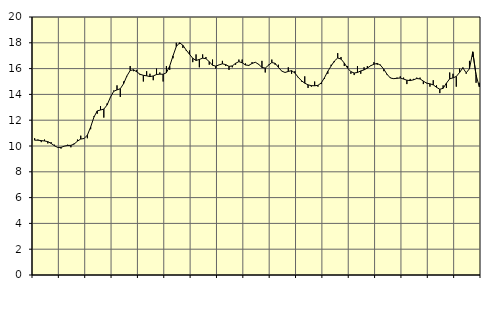
| Category | Piggar | Series 1 |
|---|---|---|
| nan | 10.6 | 10.45 |
| 87.0 | 10.5 | 10.45 |
| 87.0 | 10.3 | 10.42 |
| 87.0 | 10.5 | 10.39 |
| nan | 10.2 | 10.34 |
| 88.0 | 10.3 | 10.2 |
| 88.0 | 10.1 | 10.02 |
| 88.0 | 9.9 | 9.89 |
| nan | 9.8 | 9.89 |
| 89.0 | 10 | 9.99 |
| 89.0 | 10.1 | 10.04 |
| 89.0 | 9.9 | 10.05 |
| nan | 10.2 | 10.15 |
| 90.0 | 10.5 | 10.38 |
| 90.0 | 10.8 | 10.54 |
| 90.0 | 10.6 | 10.58 |
| nan | 10.6 | 10.84 |
| 91.0 | 11.3 | 11.47 |
| 91.0 | 12.3 | 12.24 |
| 91.0 | 12.5 | 12.72 |
| nan | 13.1 | 12.79 |
| 92.0 | 12.2 | 12.86 |
| 92.0 | 13.3 | 13.18 |
| 92.0 | 13.8 | 13.78 |
| nan | 14.3 | 14.24 |
| 93.0 | 14.7 | 14.35 |
| 93.0 | 13.8 | 14.44 |
| 93.0 | 15 | 14.83 |
| nan | 15.4 | 15.43 |
| 94.0 | 16.2 | 15.85 |
| 94.0 | 15.8 | 15.91 |
| 94.0 | 15.9 | 15.75 |
| nan | 15.5 | 15.56 |
| 95.0 | 15 | 15.48 |
| 95.0 | 15.8 | 15.44 |
| 95.0 | 15.6 | 15.38 |
| nan | 15.1 | 15.43 |
| 96.0 | 16 | 15.54 |
| 96.0 | 15.7 | 15.57 |
| 96.0 | 15 | 15.56 |
| nan | 16.2 | 15.68 |
| 97.0 | 15.9 | 16.2 |
| 97.0 | 16.8 | 16.99 |
| 97.0 | 18 | 17.71 |
| nan | 17.9 | 18 |
| 98.0 | 17.6 | 17.81 |
| 98.0 | 17.4 | 17.44 |
| 98.0 | 17.4 | 17.11 |
| nan | 16.5 | 16.8 |
| 99.0 | 17.1 | 16.63 |
| 99.0 | 16.1 | 16.71 |
| 99.0 | 17.1 | 16.81 |
| nan | 16.9 | 16.77 |
| 0.0 | 16.3 | 16.54 |
| 0.0 | 16.7 | 16.26 |
| 0.0 | 16 | 16.19 |
| nan | 16.3 | 16.29 |
| 1.0 | 16.6 | 16.37 |
| 1.0 | 16.2 | 16.31 |
| 1.0 | 15.9 | 16.17 |
| nan | 16.1 | 16.21 |
| 2.0 | 16.3 | 16.41 |
| 2.0 | 16.7 | 16.54 |
| 2.0 | 16.7 | 16.45 |
| nan | 16.4 | 16.28 |
| 3.0 | 16.2 | 16.25 |
| 3.0 | 16.5 | 16.4 |
| 3.0 | 16.5 | 16.49 |
| nan | 16.3 | 16.33 |
| 4.0 | 16.6 | 16.09 |
| 4.0 | 15.7 | 16.04 |
| 4.0 | 16.3 | 16.26 |
| nan | 16.7 | 16.47 |
| 5.0 | 16.3 | 16.41 |
| 5.0 | 16.3 | 16.1 |
| 5.0 | 15.8 | 15.81 |
| nan | 15.7 | 15.7 |
| 6.0 | 16.1 | 15.78 |
| 6.0 | 15.6 | 15.84 |
| 6.0 | 15.8 | 15.66 |
| nan | 15.3 | 15.33 |
| 7.0 | 15 | 15.06 |
| 7.0 | 15.4 | 14.87 |
| 7.0 | 14.5 | 14.74 |
| nan | 14.6 | 14.68 |
| 8.0 | 15 | 14.67 |
| 8.0 | 14.6 | 14.7 |
| 8.0 | 14.8 | 14.89 |
| nan | 15.2 | 15.3 |
| 9.0 | 15.6 | 15.79 |
| 9.0 | 16.3 | 16.2 |
| 9.0 | 16.5 | 16.59 |
| nan | 17.2 | 16.82 |
| 10.0 | 16.9 | 16.74 |
| 10.0 | 16.2 | 16.43 |
| 10.0 | 16.2 | 16.04 |
| nan | 15.6 | 15.76 |
| 11.0 | 15.5 | 15.66 |
| 11.0 | 16.2 | 15.7 |
| 11.0 | 15.6 | 15.82 |
| nan | 16.1 | 15.9 |
| 12.0 | 16.2 | 16.04 |
| 12.0 | 16.2 | 16.22 |
| 12.0 | 16.5 | 16.34 |
| nan | 16.3 | 16.4 |
| 13.0 | 16.3 | 16.26 |
| 13.0 | 15.8 | 15.95 |
| 13.0 | 15.5 | 15.55 |
| nan | 15.3 | 15.27 |
| 14.0 | 15.2 | 15.22 |
| 14.0 | 15.3 | 15.25 |
| 14.0 | 15.4 | 15.27 |
| nan | 15.3 | 15.19 |
| 15.0 | 14.8 | 15.1 |
| 15.0 | 15.2 | 15.07 |
| 15.0 | 15.2 | 15.13 |
| nan | 15.3 | 15.23 |
| 16.0 | 15.3 | 15.2 |
| 16.0 | 14.8 | 15.03 |
| 16.0 | 14.9 | 14.87 |
| nan | 14.6 | 14.82 |
| 17.0 | 15.1 | 14.74 |
| 17.0 | 14.7 | 14.55 |
| 17.0 | 14.1 | 14.4 |
| nan | 14.7 | 14.47 |
| 18.0 | 14.5 | 14.87 |
| 18.0 | 15.7 | 15.21 |
| 18.0 | 15.6 | 15.28 |
| nan | 14.6 | 15.39 |
| 19.0 | 16 | 15.7 |
| 19.0 | 16.1 | 16.06 |
| 19.0 | 15.6 | 15.67 |
| nan | 16.6 | 15.99 |
| 20.0 | 16.9 | 17.3 |
| 20.0 | 14.9 | 15.5 |
| 20.0 | 14.9 | 14.58 |